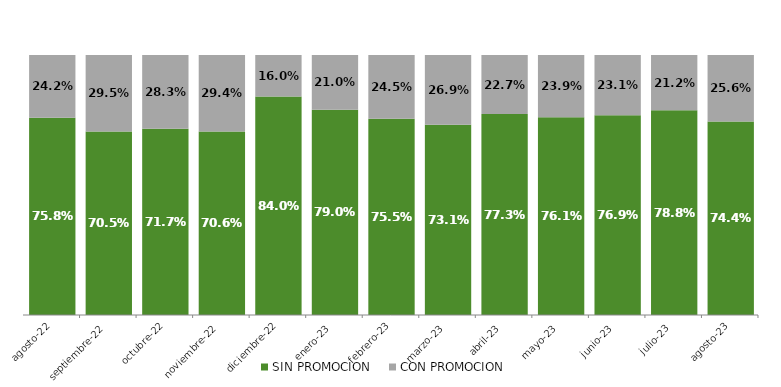
| Category | SIN PROMOCION   | CON PROMOCION   |
|---|---|---|
| 2022-08-01 | 0.758 | 0.242 |
| 2022-09-01 | 0.705 | 0.295 |
| 2022-10-01 | 0.717 | 0.283 |
| 2022-11-01 | 0.706 | 0.294 |
| 2022-12-01 | 0.84 | 0.16 |
| 2023-01-01 | 0.79 | 0.21 |
| 2023-02-01 | 0.755 | 0.245 |
| 2023-03-01 | 0.731 | 0.269 |
| 2023-04-01 | 0.773 | 0.227 |
| 2023-05-01 | 0.761 | 0.239 |
| 2023-06-01 | 0.769 | 0.231 |
| 2023-07-01 | 0.788 | 0.212 |
| 2023-08-01 | 0.744 | 0.256 |